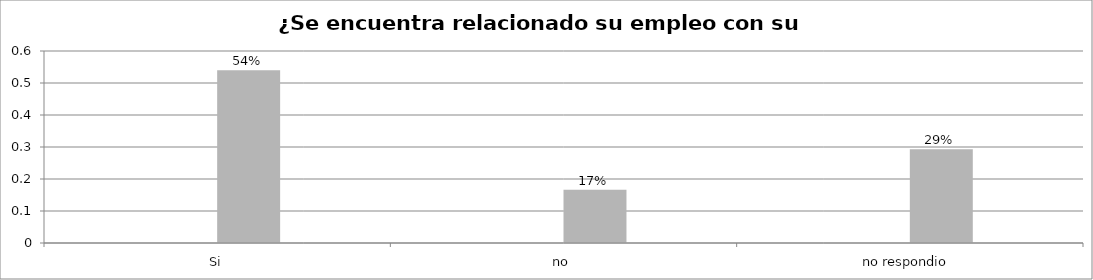
| Category | Series 0 | Series 1 | Series 2 | Series 3 |
|---|---|---|---|---|
| Si |  |  | 0.54 |  |
| no  |  |  | 0.167 |  |
| no respondio  |  |  | 0.293 |  |